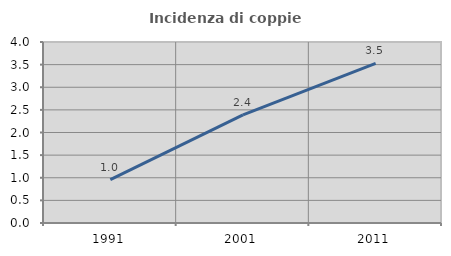
| Category | Incidenza di coppie miste |
|---|---|
| 1991.0 | 0.958 |
| 2001.0 | 2.388 |
| 2011.0 | 3.529 |